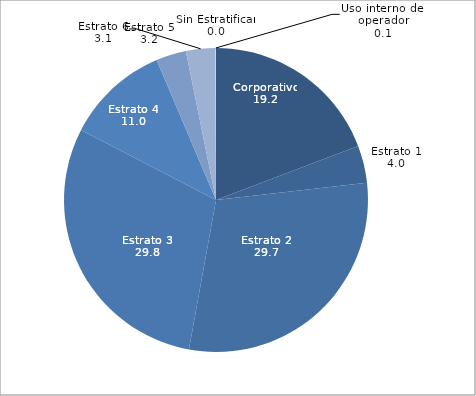
| Category | Series 0 |
|---|---|
| Corporativo | 19.231 |
| Estrato 1 | 3.969 |
| Estrato 2 | 29.65 |
| Estrato 3 | 29.766 |
| Estrato 4 | 10.995 |
| Estrato 5 | 3.21 |
| Estrato 6 | 3.127 |
| Sin Estratificar | 0 |
| Uso interno del operador | 0.051 |